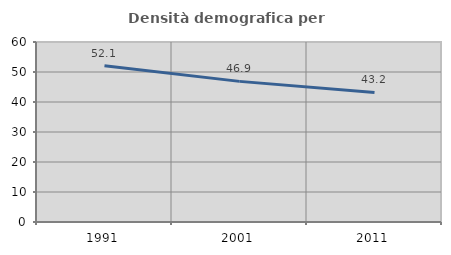
| Category | Densità demografica |
|---|---|
| 1991.0 | 52.096 |
| 2001.0 | 46.875 |
| 2011.0 | 43.194 |